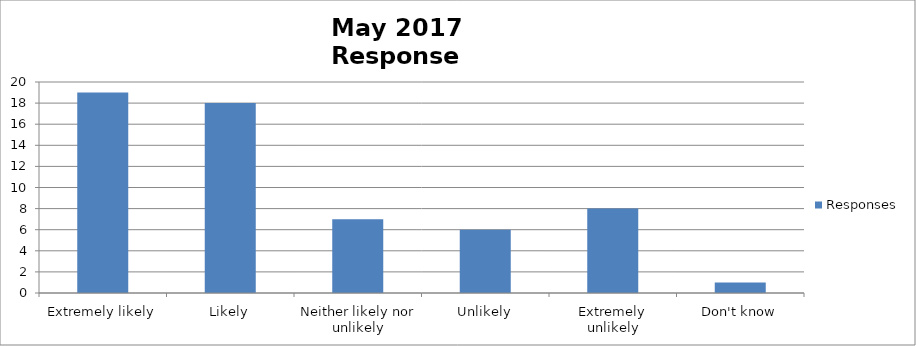
| Category | Responses |
|---|---|
| Extremely likely | 19 |
| Likely | 18 |
| Neither likely nor unlikely | 7 |
| Unlikely | 6 |
| Extremely unlikely | 8 |
| Don't know | 1 |